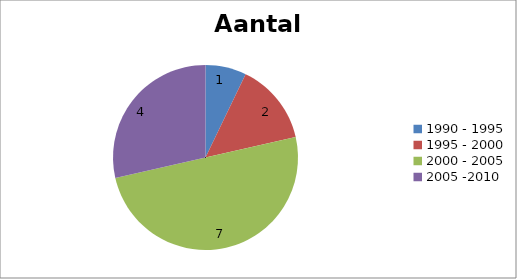
| Category | Aantal |
|---|---|
| 1990 - 1995 | 1 |
| 1995 - 2000 | 2 |
| 2000 - 2005 | 7 |
| 2005 -2010 | 4 |